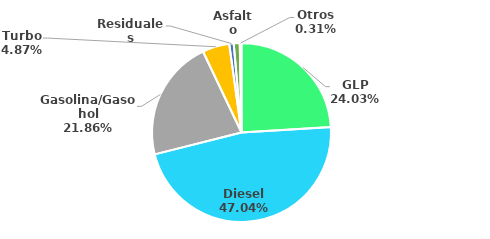
| Category | MBPD |
|---|---|
| GLP | 60.035 |
| Diesel | 117.508 |
| Gasolina/Gasohol | 54.609 |
| Turbo | 12.171 |
| Residuales | 2.007 |
| Asfalto | 2.7 |
| Otros | 0.775 |